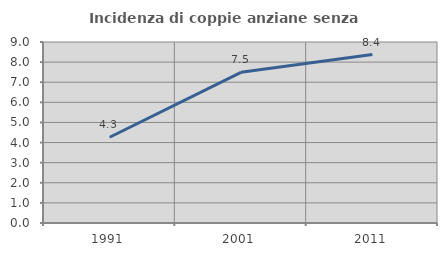
| Category | Incidenza di coppie anziane senza figli  |
|---|---|
| 1991.0 | 4.264 |
| 2001.0 | 7.491 |
| 2011.0 | 8.378 |